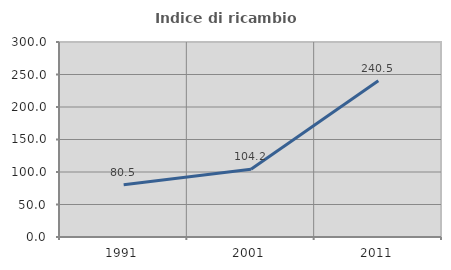
| Category | Indice di ricambio occupazionale  |
|---|---|
| 1991.0 | 80.537 |
| 2001.0 | 104.199 |
| 2011.0 | 240.53 |